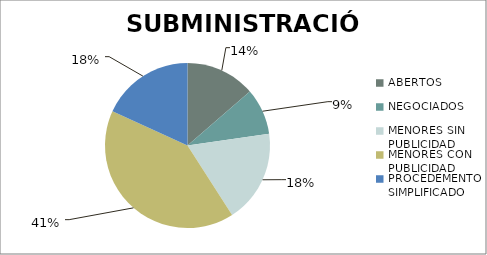
| Category | Series 0 |
|---|---|
| ABERTOS  | 3 |
| NEGOCIADOS  | 2 |
| MENORES SIN PUBLICIDAD | 4 |
| MENORES CON PUBLICIDAD | 9 |
| PROCEDEMENTO SIMPLIFICADO | 4 |